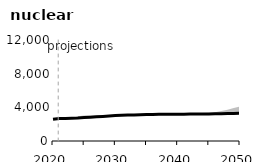
| Category | Ref |
|---|---|
| 2020.0 | 2577.898 |
| 2021.0 | 2679.075 |
| 2022.0 | 2666.06 |
| 2023.0 | 2696.593 |
| 2024.0 | 2732.24 |
| 2025.0 | 2785.629 |
| 2026.0 | 2829.856 |
| 2027.0 | 2881.643 |
| 2028.0 | 2924.325 |
| 2029.0 | 2976.112 |
| 2030.0 | 3020.388 |
| 2031.0 | 3059.948 |
| 2032.0 | 3099.51 |
| 2033.0 | 3096.364 |
| 2034.0 | 3129.256 |
| 2035.0 | 3160.263 |
| 2036.0 | 3163.232 |
| 2037.0 | 3171.364 |
| 2038.0 | 3171.813 |
| 2039.0 | 3181.02 |
| 2040.0 | 3180.878 |
| 2041.0 | 3187.913 |
| 2042.0 | 3195.078 |
| 2043.0 | 3202.199 |
| 2044.0 | 3209.349 |
| 2045.0 | 3216.217 |
| 2046.0 | 3232.41 |
| 2047.0 | 3248.651 |
| 2048.0 | 3264.225 |
| 2049.0 | 3280.778 |
| 2050.0 | 3296.815 |